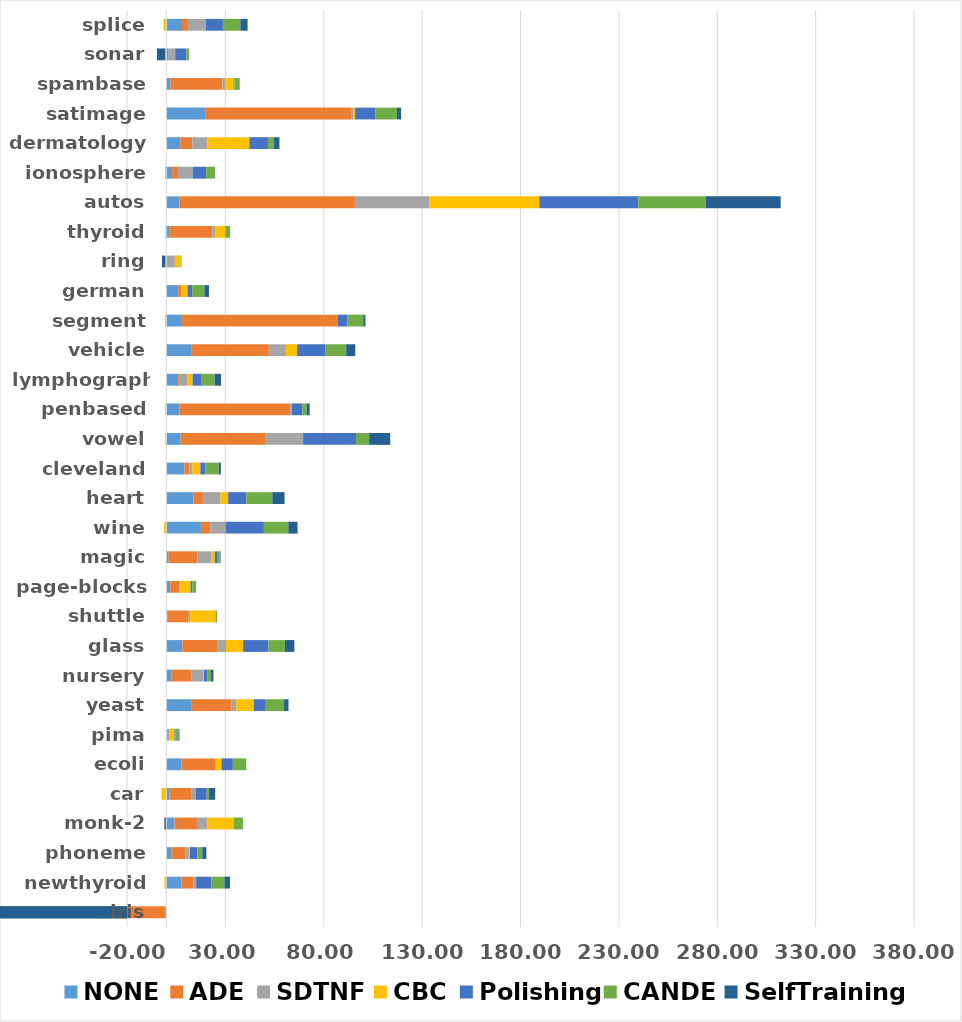
| Category | NONE | ADE | SDTNF | CBC | Polishing | CANDE | SelfTraining |
|---|---|---|---|---|---|---|---|
| iris | -0.5 | -34.812 | -28.145 | -36.812 | -27.345 | -28.545 | -34.412 |
| newthyroid | 7.721 | 5.953 | 1.488 | -0.93 | 7.628 | 6.698 | 2.884 |
| phoneme | 2.461 | 7.34 | 1.658 | 0.552 | 3.753 | 2.524 | 2.065 |
| monk-2 | 4.165 | 11.384 | 5.192 | 13.43 | -0.186 | 4.763 | -0.836 |
| car | 1.714 | 10.869 | 2.443 | -2.499 | 5.499 | 1.192 | 3.09 |
| ecoli | 7.723 | 17.226 | 0.171 | 2.926 | 5.763 | 6.779 | -0.064 |
| pima | 0.316 | 0.025 | 1.25 | 2.526 | 0.549 | 1.542 | 0.444 |
| yeast | 12.925 | 20.192 | 2.413 | 9.018 | 5.997 | 9.3 | 2.237 |
| nursery | 2.469 | 10.408 | 6.033 | 0.2 | 1.836 | 1.774 | 1.218 |
| glass | 8.106 | 18.022 | 4.186 | 8.693 | 12.895 | 8.396 | 4.771 |
| shuttle | 0.653 | 10.667 | 0.791 | 12.929 | 0.101 | 0.625 | 0.018 |
| page-blocks | 2.003 | 4.587 | 0.482 | 5.212 | 0.841 | 1.941 | 0.055 |
| magic | 1.128 | 14.725 | 7.138 | 1.606 | 1.151 | 1.414 | 0.361 |
| wine | 17.575 | 4.79 | 7.797 | -1.133 | 19.41 | 12.416 | 4.683 |
| heart | 13.704 | 4.889 | 8.889 | 3.926 | 9.259 | 13.185 | 6.222 |
| cleveland | 9.216 | 2.484 | 1.478 | 4.099 | 2.469 | 6.846 | 1.129 |
| vowel | 7.273 | 42.909 | 19.333 | -0.505 | 26.929 | 6.626 | 10.727 |
| penbased | 6.592 | 56.432 | 0.744 | -0.484 | 5.297 | 2.298 | 1.483 |
| lymphography | 6.009 | 0.423 | 4.202 | 2.694 | 4.29 | 6.938 | 3.264 |
| vehicle | 12.602 | 39.471 | 8.675 | 5.742 | 14.442 | 10.471 | 4.632 |
| segment | 8.009 | 79.117 | -0.009 | -0.615 | 4.944 | 8.009 | 1.1 |
| german | 6 | 1.54 | -0.16 | 3.24 | 2.38 | 6.18 | 2.3 |
| ring | -0.368 | -0.122 | 4.346 | 3.003 | -0.132 | 0.37 | -1.565 |
| thyroid | 1.453 | 21.95 | 1.547 | 4.969 | -0.042 | 2.506 | -0.253 |
| autos | 6.667 | 89.192 | 37.748 | 55.958 | 50.309 | 34.224 | 38.119 |
| ionosphere | 2.905 | 3.017 | 7.401 | -0.286 | 6.894 | 4.558 | -0.171 |
| dermatology | 7.093 | 6.15 | 7.707 | 21.243 | 9.438 | 3.124 | 2.739 |
| satimage | 19.699 | 74.179 | 1.343 | 0.702 | 10.306 | 10.981 | 2.082 |
| spambase | 2.092 | 26.411 | 1.51 | 4.138 | 0.409 | 2.762 | -0.139 |
| sonar | 1.187 | -0.035 | 3.312 | -0.539 | 5.742 | 1.37 | -4.223 |
| splice | 7.956 | 3.011 | 9.137 | -1.461 | 8.655 | 8.845 | 3.687 |